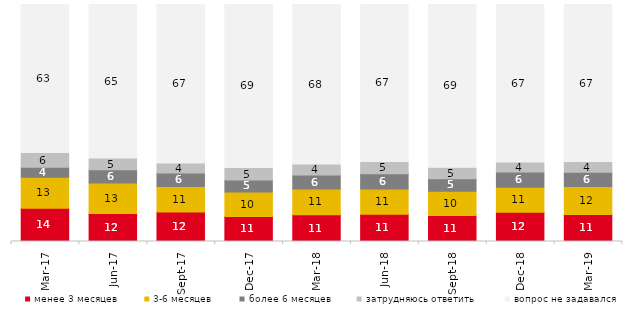
| Category | менее 3 месяцев | 3-6 месяцев | более 6 месяцев | затрудняюсь ответить | вопрос не задавался |
|---|---|---|---|---|---|
| 2017-03-01 | 14.05 | 13.05 | 4.25 | 5.85 | 62.8 |
| 2017-06-01 | 11.8 | 12.85 | 5.65 | 4.65 | 65.05 |
| 2017-09-01 | 12.45 | 10.75 | 5.7 | 3.9 | 67.2 |
| 2017-12-01 | 10.55 | 10.3 | 5.15 | 4.95 | 69.05 |
| 2018-03-01 | 11.3 | 10.8 | 6 | 4.25 | 67.65 |
| 2018-06-01 | 11.45 | 10.75 | 6.4 | 4.85 | 66.55 |
| 2018-09-01 | 10.95 | 10.3 | 5.2 | 4.55 | 69 |
| 2018-12-01 | 12.3 | 10.6 | 6.4 | 3.95 | 66.75 |
| 2019-03-01 | 11.437 | 11.735 | 6.067 | 4.078 | 66.683 |